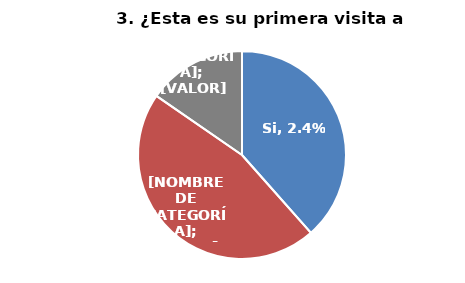
| Category | Series 0 |
|---|---|
| Si | 0.024 |
| No | 0.029 |
| Ns/Nr | 0.01 |